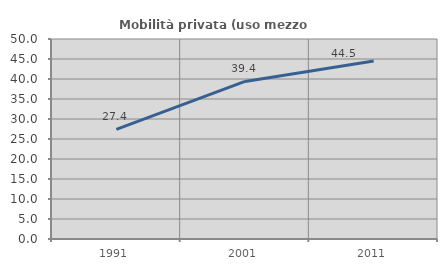
| Category | Mobilità privata (uso mezzo privato) |
|---|---|
| 1991.0 | 27.419 |
| 2001.0 | 39.394 |
| 2011.0 | 44.521 |